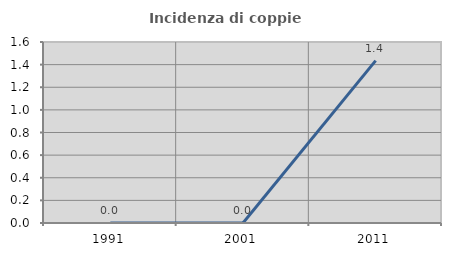
| Category | Incidenza di coppie miste |
|---|---|
| 1991.0 | 0 |
| 2001.0 | 0 |
| 2011.0 | 1.435 |